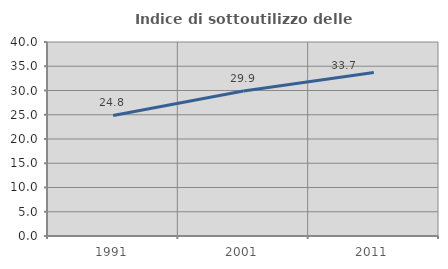
| Category | Indice di sottoutilizzo delle abitazioni  |
|---|---|
| 1991.0 | 24.846 |
| 2001.0 | 29.913 |
| 2011.0 | 33.721 |